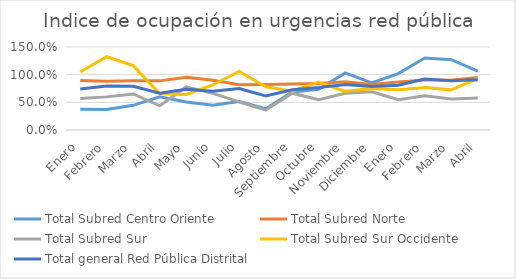
| Category | Total Subred Centro Oriente | Total Subred Norte | Total Subred Sur | Total Subred Sur Occidente | Total general Red Pública Distrital |
|---|---|---|---|---|---|
| Enero | 0.373 | 0.895 | 0.571 | 1.049 | 0.739 |
| Febrero | 0.372 | 0.882 | 0.599 | 1.324 | 0.796 |
| Marzo | 0.446 | 0.89 | 0.651 | 1.163 | 0.79 |
| Abril | 0.599 | 0.888 | 0.438 | 0.654 | 0.663 |
| Mayo | 0.507 | 0.954 | 0.781 | 0.641 | 0.738 |
| Junio | 0.448 | 0.897 | 0.661 | 0.814 | 0.703 |
| Julio | 0.513 | 0.82 | 0.509 | 1.057 | 0.75 |
| Agosto | 0.384 | 0.822 | 0.361 | 0.782 | 0.614 |
| Septiembre | 0.688 | 0.831 | 0.665 | 0.702 | 0.728 |
| Octubre | 0.735 | 0.842 | 0.55 | 0.867 | 0.767 |
| Noviembre | 1.033 | 0.873 | 0.663 | 0.698 | 0.822 |
| Diciembre | 0.851 | 0.821 | 0.691 | 0.749 | 0.786 |
| Enero | 1.02 | 0.866 | 0.549 | 0.727 | 0.808 |
| Febrero | 1.301 | 0.906 | 0.621 | 0.767 | 0.922 |
| Marzo | 1.27 | 0.898 | 0.56 | 0.726 | 0.892 |
| Abril | 1.066 | 0.949 | 0.577 | 0.932 | 0.909 |